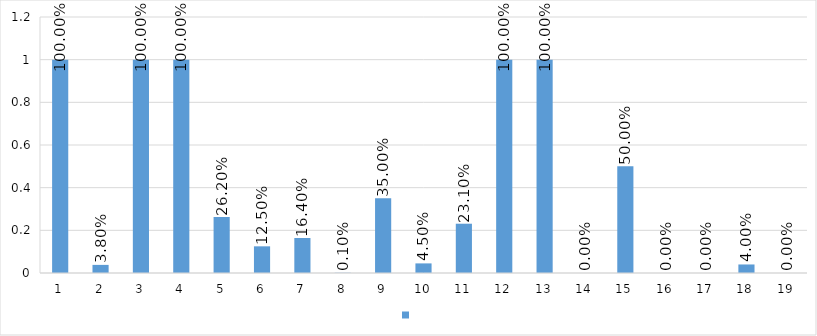
| Category | Series 0 |
|---|---|
| 1 | 1 |
| 2 | 0.038 |
| 3 | 1 |
| 4 | 1 |
| 5 | 0.262 |
| 6 | 0.125 |
| 7 | 0.164 |
| 8 | 0.001 |
| 9 | 0.35 |
| 10 | 0.045 |
| 11 | 0.231 |
| 12 | 1 |
| 13 | 1 |
| 14 | 0 |
| 15 | 0.5 |
| 16 | 0 |
| 17 | 0 |
| 18 | 0.04 |
| 19 | 0 |